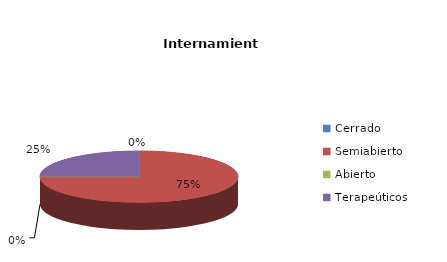
| Category | Series 0 |
|---|---|
| Cerrado | 0 |
| Semiabierto | 12 |
| Abierto | 0 |
| Terapeúticos | 4 |